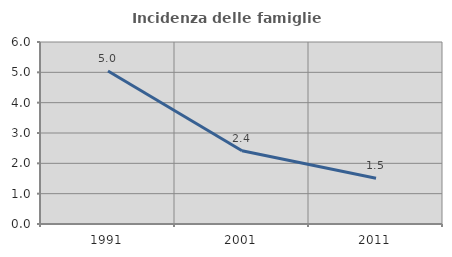
| Category | Incidenza delle famiglie numerose |
|---|---|
| 1991.0 | 5.042 |
| 2001.0 | 2.417 |
| 2011.0 | 1.507 |